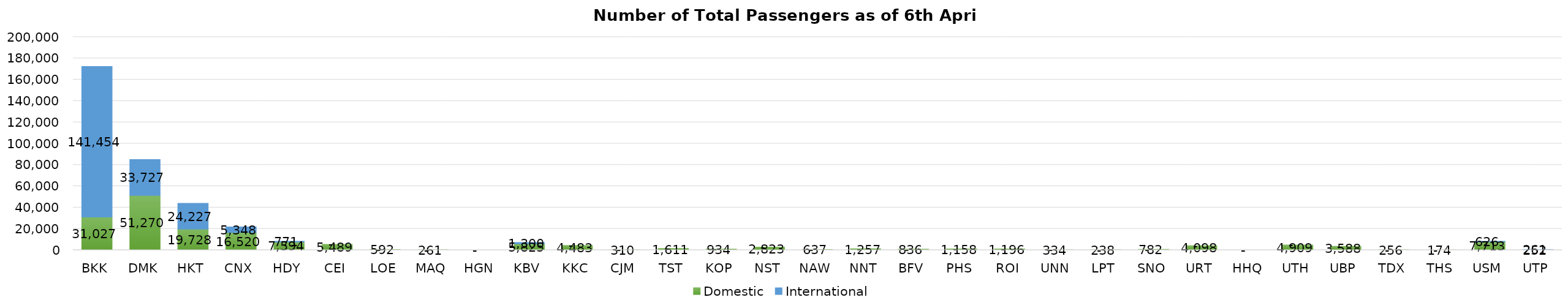
| Category | Domestic | International |
|---|---|---|
| BKK | 31027 | 141454 |
| DMK | 51270 | 33727 |
| HKT | 19728 | 24227 |
| CNX | 16520 | 5348 |
| HDY | 7594 | 771 |
| CEI | 5489 | 0 |
| LOE | 592 | 0 |
| MAQ | 261 | 0 |
| HGN | 0 | 0 |
| KBV | 5825 | 1300 |
| KKC | 4483 | 0 |
| CJM | 310 | 0 |
| TST | 1611 | 0 |
| KOP | 934 | 0 |
| NST | 2823 | 0 |
| NAW | 637 | 0 |
| NNT | 1257 | 0 |
| BFV | 836 | 0 |
| PHS | 1158 | 0 |
| ROI | 1196 | 0 |
| UNN | 334 | 0 |
| LPT | 238 | 0 |
| SNO | 782 | 0 |
| URT | 4098 | 0 |
| HHQ | 0 | 0 |
| UTH | 4909 | 0 |
| UBP | 3588 | 0 |
| TDX | 256 | 0 |
| THS | 174 | 0 |
| USM | 7713 | 626 |
| UTP | 252 | 261 |